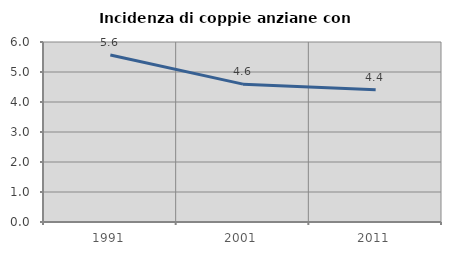
| Category | Incidenza di coppie anziane con figli |
|---|---|
| 1991.0 | 5.567 |
| 2001.0 | 4.595 |
| 2011.0 | 4.412 |